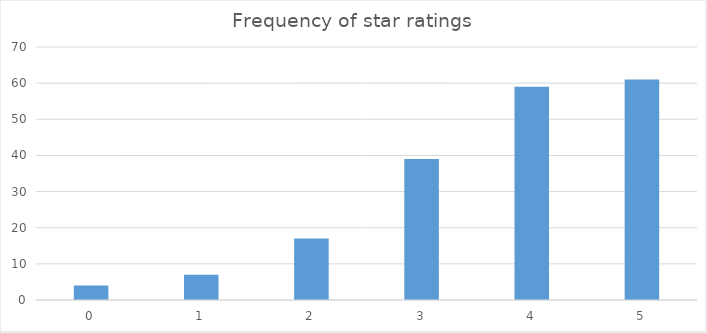
| Category | Series 0 |
|---|---|
| 0.0 | 4 |
| 1.0 | 7 |
| 2.0 | 17 |
| 3.0 | 39 |
| 4.0 | 59 |
| 5.0 | 61 |